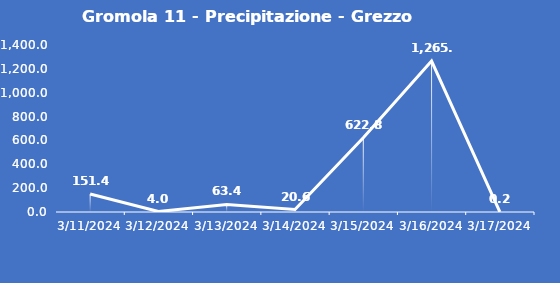
| Category | Gromola 11 - Precipitazione - Grezzo (mm) |
|---|---|
| 3/11/24 | 151.4 |
| 3/12/24 | 4 |
| 3/13/24 | 63.4 |
| 3/14/24 | 20.6 |
| 3/15/24 | 622.8 |
| 3/16/24 | 1265.2 |
| 3/17/24 | 0.2 |